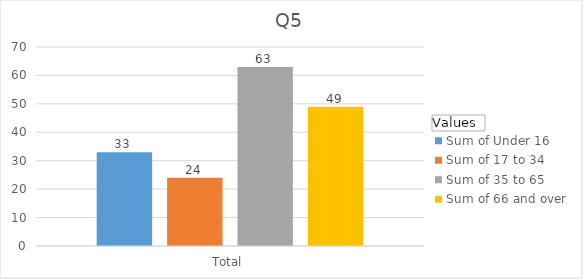
| Category | Sum of Under 16 | Sum of 17 to 34 | Sum of 35 to 65 | Sum of 66 and over |
|---|---|---|---|---|
| Total | 33 | 24 | 63 | 49 |